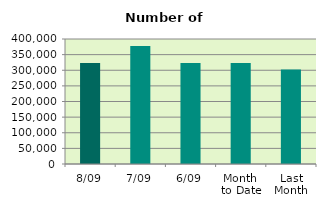
| Category | Series 0 |
|---|---|
| 8/09 | 323076 |
| 7/09 | 377996 |
| 6/09 | 323272 |
| Month 
to Date | 323417.667 |
| Last
Month | 302693.565 |